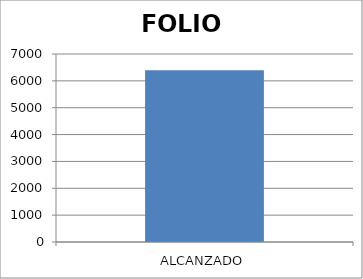
| Category | FOLIO |
|---|---|
| ALCANZADO | 6398 |